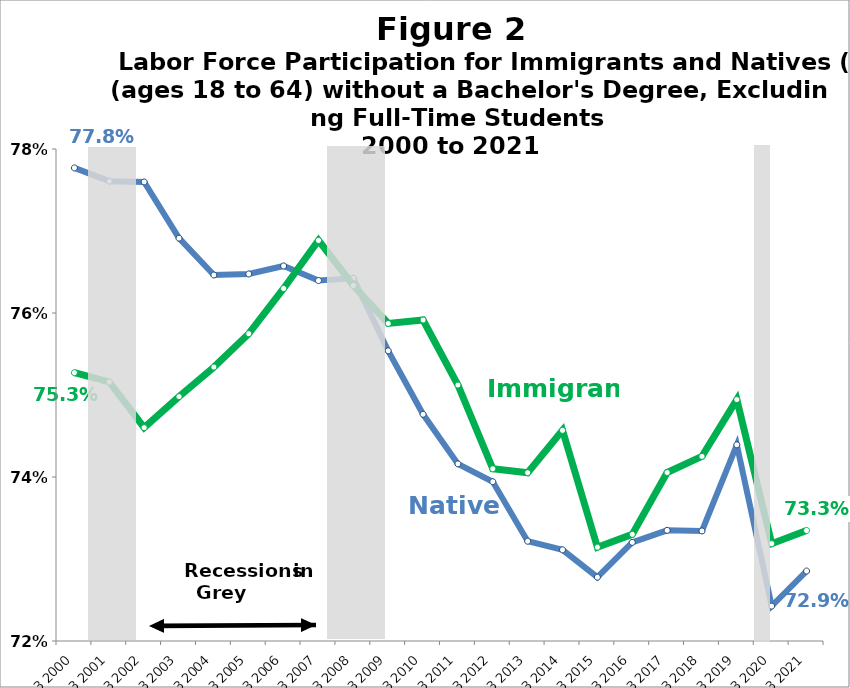
| Category | Native | Immigrant |
|---|---|---|
| Q3 2000 | 0.778 | 0.753 |
| Q3 2001 | 0.776 | 0.752 |
| Q3 2002 | 0.776 | 0.746 |
| Q3 2003 | 0.769 | 0.75 |
| Q3 2004 | 0.765 | 0.753 |
| Q3 2005 | 0.765 | 0.757 |
| Q3 2006 | 0.766 | 0.763 |
| Q3 2007 | 0.764 | 0.769 |
| Q3 2008 | 0.764 | 0.763 |
| Q3 2009 | 0.755 | 0.759 |
| Q3 2010 | 0.748 | 0.759 |
| Q3 2011 | 0.742 | 0.751 |
| Q3 2012 | 0.739 | 0.741 |
| Q3 2013 | 0.732 | 0.741 |
| Q3 2014 | 0.731 | 0.746 |
| Q3 2015 | 0.728 | 0.731 |
| Q3 2016 | 0.732 | 0.733 |
| Q3 2017 | 0.733 | 0.741 |
| Q3 2018 | 0.733 | 0.743 |
| Q3 2019 | 0.744 | 0.749 |
| Q3 2020 | 0.724 | 0.732 |
| Q3 2021 | 0.729 | 0.733 |